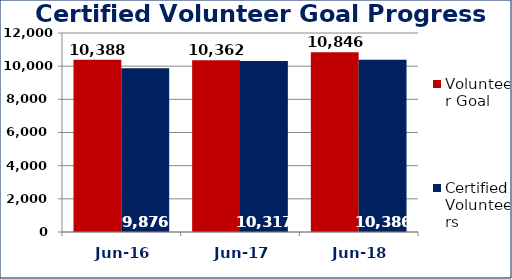
| Category | Volunteer Goal  | Certified Volunteers  |
|---|---|---|
| Jun-16 | 10388 | 9876 |
| Jun-17 | 10362 | 10317 |
| Jun-18 | 10846 | 10386 |